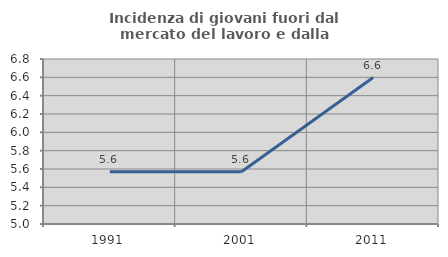
| Category | Incidenza di giovani fuori dal mercato del lavoro e dalla formazione  |
|---|---|
| 1991.0 | 5.57 |
| 2001.0 | 5.571 |
| 2011.0 | 6.597 |